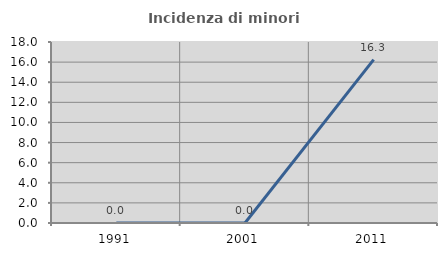
| Category | Incidenza di minori stranieri |
|---|---|
| 1991.0 | 0 |
| 2001.0 | 0 |
| 2011.0 | 16.25 |